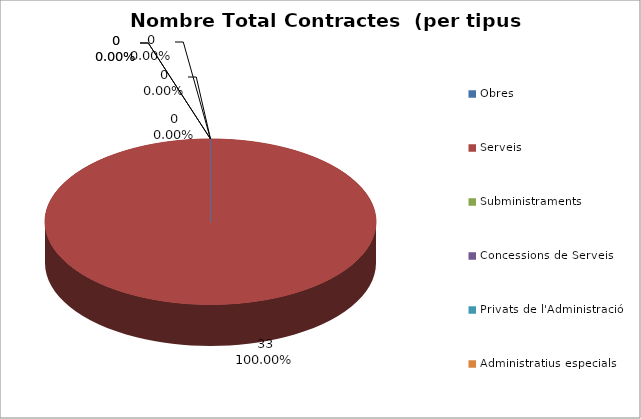
| Category | Nombre Total Contractes |
|---|---|
| Obres | 0 |
| Serveis | 33 |
| Subministraments | 0 |
| Concessions de Serveis | 0 |
| Privats de l'Administració | 0 |
| Administratius especials | 0 |